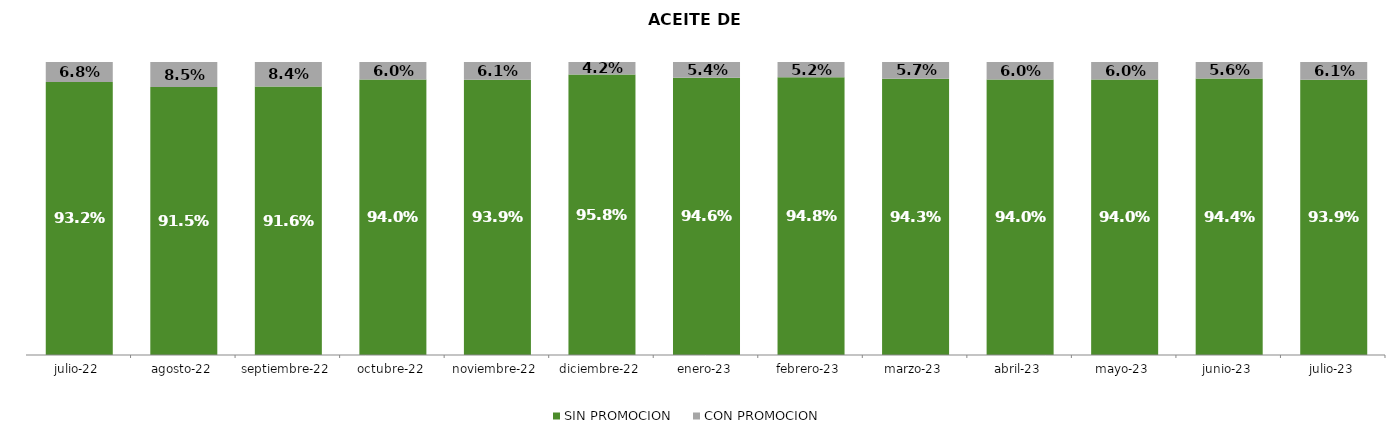
| Category | SIN PROMOCION   | CON PROMOCION   |
|---|---|---|
| 2022-07-01 | 0.932 | 0.068 |
| 2022-08-01 | 0.915 | 0.085 |
| 2022-09-01 | 0.916 | 0.084 |
| 2022-10-01 | 0.94 | 0.06 |
| 2022-11-01 | 0.939 | 0.061 |
| 2022-12-01 | 0.958 | 0.042 |
| 2023-01-01 | 0.946 | 0.054 |
| 2023-02-01 | 0.948 | 0.052 |
| 2023-03-01 | 0.943 | 0.057 |
| 2023-04-01 | 0.94 | 0.06 |
| 2023-05-01 | 0.94 | 0.06 |
| 2023-06-01 | 0.944 | 0.056 |
| 2023-07-01 | 0.939 | 0.061 |